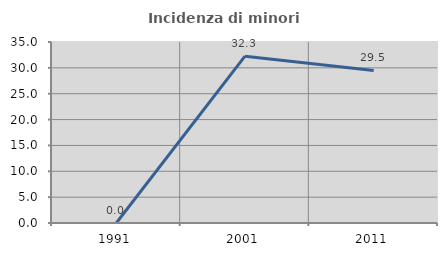
| Category | Incidenza di minori stranieri |
|---|---|
| 1991.0 | 0 |
| 2001.0 | 32.258 |
| 2011.0 | 29.493 |